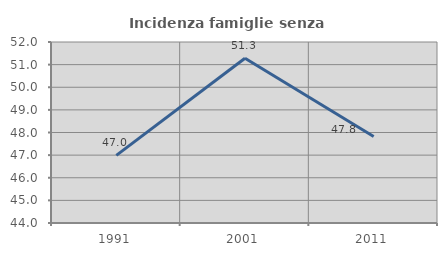
| Category | Incidenza famiglie senza nuclei |
|---|---|
| 1991.0 | 46.988 |
| 2001.0 | 51.282 |
| 2011.0 | 47.826 |